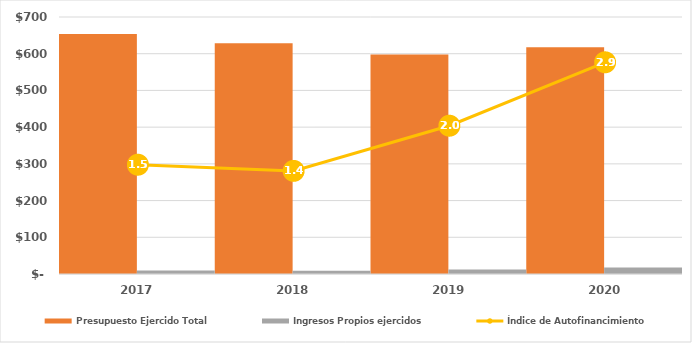
| Category | Presupuesto Ejercido Total | Ingresos Propios ejercidos |
|---|---|---|
| 2017.0 | 653670.792 | 9727.901 |
| 2018.0 | 628799.563 | 8828.859 |
| 2019.0 | 598040.902 | 12076.572 |
| 2020.0 | 617347.742 | 17799.164 |